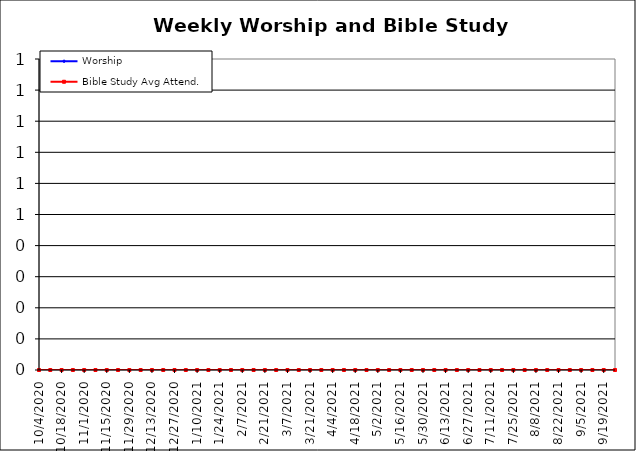
| Category | Worship | Bible Study Avg Attend. |
|---|---|---|
| 10/4/20 | 0 | 0 |
| 10/11/20 | 0 | 0 |
| 10/18/20 | 0 | 0 |
| 10/25/20 | 0 | 0 |
| 11/1/20 | 0 | 0 |
| 11/8/20 | 0 | 0 |
| 11/15/20 | 0 | 0 |
| 11/22/20 | 0 | 0 |
| 11/29/20 | 0 | 0 |
| 12/6/20 | 0 | 0 |
| 12/13/20 | 0 | 0 |
| 12/20/20 | 0 | 0 |
| 12/27/20 | 0 | 0 |
| 1/3/21 | 0 | 0 |
| 1/10/21 | 0 | 0 |
| 1/17/21 | 0 | 0 |
| 1/24/21 | 0 | 0 |
| 1/31/21 | 0 | 0 |
| 2/7/21 | 0 | 0 |
| 2/14/21 | 0 | 0 |
| 2/21/21 | 0 | 0 |
| 2/28/21 | 0 | 0 |
| 3/7/21 | 0 | 0 |
| 3/14/21 | 0 | 0 |
| 3/21/21 | 0 | 0 |
| 3/28/21 | 0 | 0 |
| 4/4/21 | 0 | 0 |
| 4/11/21 | 0 | 0 |
| 4/18/21 | 0 | 0 |
| 4/25/21 | 0 | 0 |
| 5/2/21 | 0 | 0 |
| 5/9/21 | 0 | 0 |
| 5/16/21 | 0 | 0 |
| 5/23/21 | 0 | 0 |
| 5/30/21 | 0 | 0 |
| 6/6/21 | 0 | 0 |
| 6/13/21 | 0 | 0 |
| 6/20/21 | 0 | 0 |
| 6/27/21 | 0 | 0 |
| 7/4/21 | 0 | 0 |
| 7/11/21 | 0 | 0 |
| 7/18/21 | 0 | 0 |
| 7/25/21 | 0 | 0 |
| 8/1/21 | 0 | 0 |
| 8/8/21 | 0 | 0 |
| 8/15/21 | 0 | 0 |
| 8/22/21 | 0 | 0 |
| 8/29/21 | 0 | 0 |
| 9/5/21 | 0 | 0 |
| 9/12/21 | 0 | 0 |
| 9/19/21 | 0 | 0 |
| 9/26/21 | 0 | 0 |